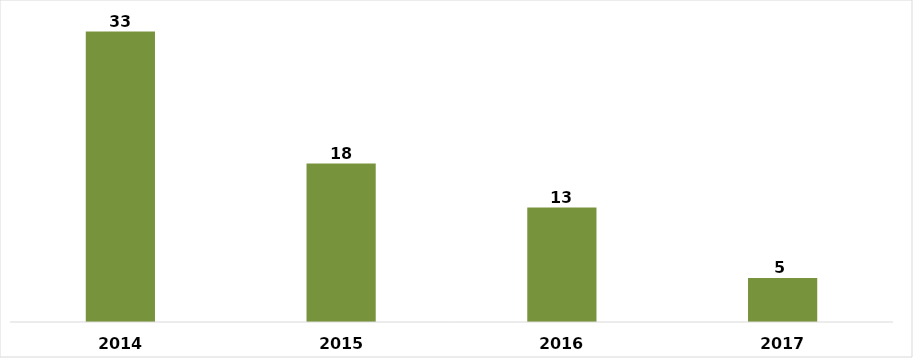
| Category | CANTIDAD |
|---|---|
| 2014.0 | 33 |
| 2015.0 | 18 |
| 2016.0 | 13 |
| 2017.0 | 5 |